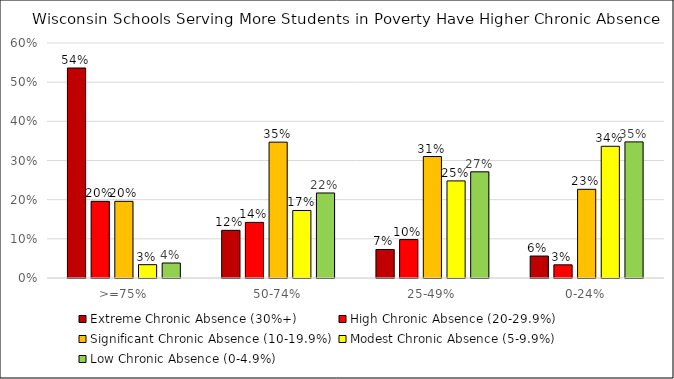
| Category | Extreme Chronic Absence (30%+) | High Chronic Absence (20-29.9%) | Significant Chronic Absence (10-19.9%) | Modest Chronic Absence (5-9.9%) | Low Chronic Absence (0-4.9%) |
|---|---|---|---|---|---|
| >=75% | 0.536 | 0.196 | 0.196 | 0.034 | 0.038 |
| 50-74% | 0.122 | 0.142 | 0.347 | 0.172 | 0.217 |
| 25-49% | 0.073 | 0.098 | 0.31 | 0.248 | 0.271 |
| 0-24% | 0.056 | 0.034 | 0.226 | 0.336 | 0.348 |